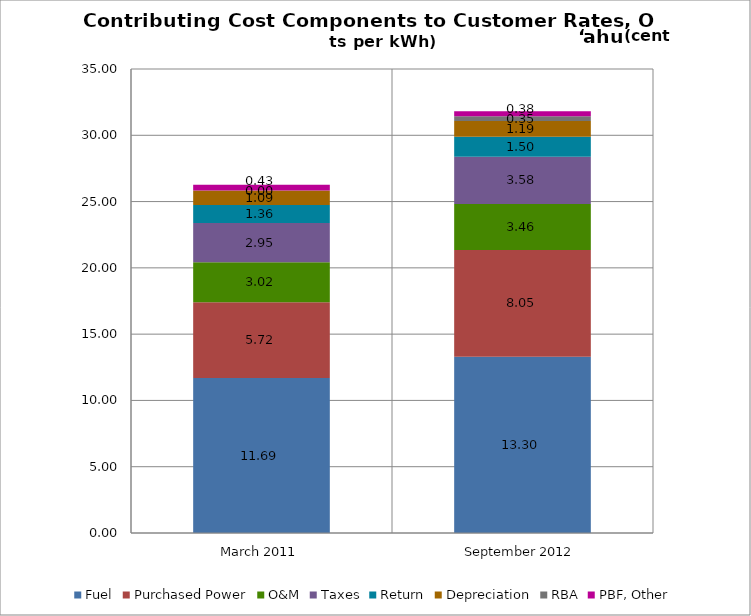
| Category | Fuel | Purchased Power | O&M | Taxes | Return | Depreciation | RBA | PBF, Other |
|---|---|---|---|---|---|---|---|---|
| March 2011 | 11.69 | 5.72 | 3.02 | 2.95 | 1.36 | 1.09 | 0 | 0.43 |
| September 2012 | 13.3 | 8.05 | 3.46 | 3.58 | 1.5 | 1.19 | 0.35 | 0.38 |